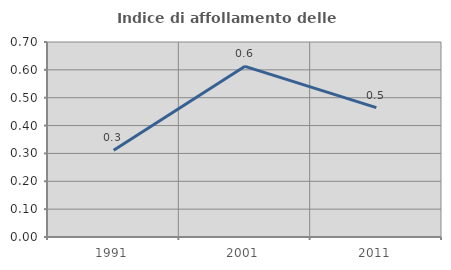
| Category | Indice di affollamento delle abitazioni  |
|---|---|
| 1991.0 | 0.312 |
| 2001.0 | 0.613 |
| 2011.0 | 0.464 |